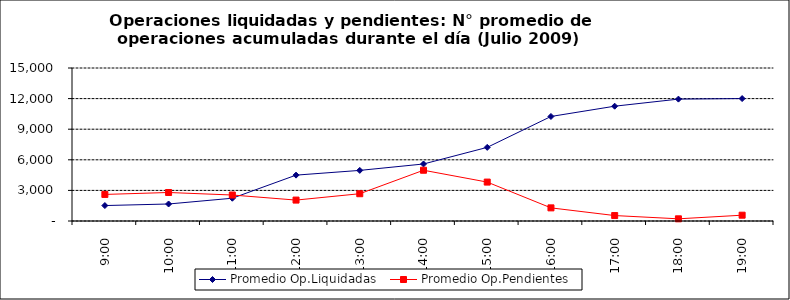
| Category | Promedio Op.Liquidadas | Promedio Op.Pendientes |
|---|---|---|
| 0.375 | 1514.591 | 2605.273 |
| 0.4166666666666667 | 1667.636 | 2795.409 |
| 0.4583333333333333 | 2233 | 2546.318 |
| 0.5 | 4497.409 | 2050.591 |
| 0.5416666666666666 | 4960.227 | 2673.182 |
| 0.5833333333333334 | 5588.818 | 4975.591 |
| 0.625 | 7218.318 | 3815.636 |
| 0.6666666666666666 | 10246.682 | 1286.864 |
| 0.7083333333333334 | 11255.227 | 534.091 |
| 0.75 | 11948.795 | 214.045 |
| 0.7916666666666666 | 12003.545 | 568.955 |